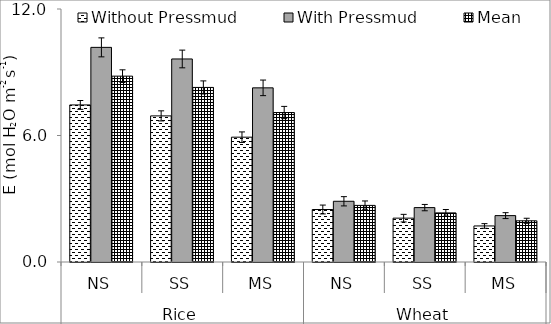
| Category | Without Pressmud | With Pressmud | Mean |
|---|---|---|---|
| 0 | 7.45 | 10.18 | 8.815 |
| 1 | 6.93 | 9.63 | 8.28 |
| 2 | 5.92 | 8.26 | 7.09 |
| 3 | 2.49 | 2.88 | 2.685 |
| 4 | 2.08 | 2.58 | 2.33 |
| 5 | 1.71 | 2.2 | 1.955 |